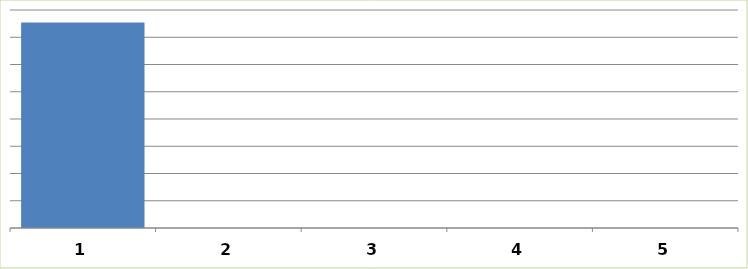
| Category | Series 0 |
|---|---|
| 0 | 3772649 |
| 1 | 0 |
| 2 | 0 |
| 3 | 0 |
| 4 | 0 |